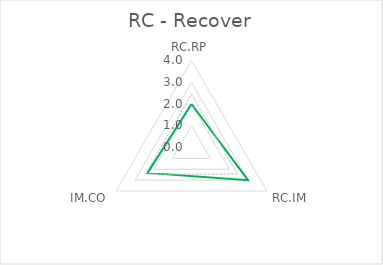
| Category | Series 0 | Series 1 |
|---|---|---|
| RC.RP | 2 | 2.444 |
| RC.IM | 3 | 2.444 |
| IM.CO | 2.333 | 2.444 |